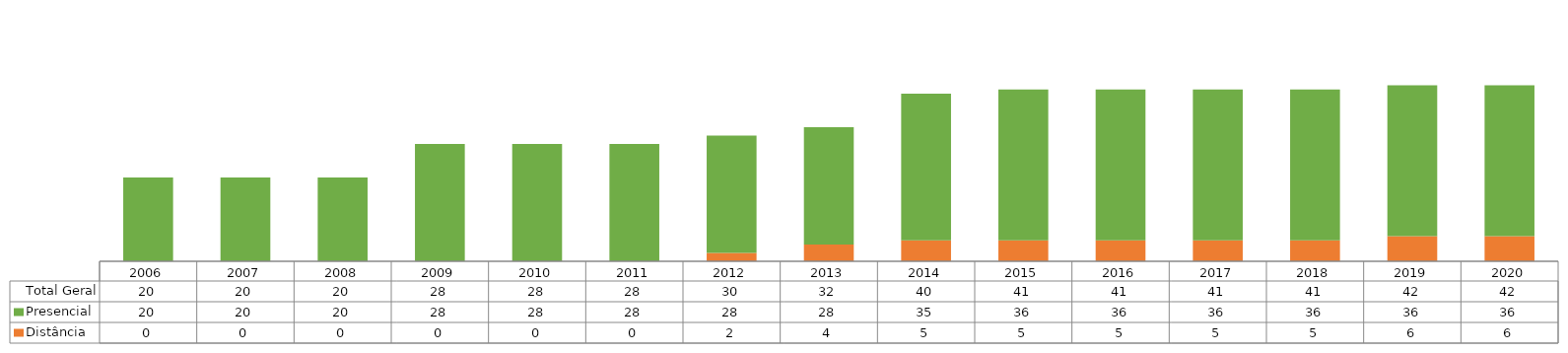
| Category | Distância | Presencial | Total Geral |
|---|---|---|---|
| 2006.0 | 0 | 20 | 20 |
| 2007.0 | 0 | 20 | 20 |
| 2008.0 | 0 | 20 | 20 |
| 2009.0 | 0 | 28 | 28 |
| 2010.0 | 0 | 28 | 28 |
| 2011.0 | 0 | 28 | 28 |
| 2012.0 | 2 | 28 | 30 |
| 2013.0 | 4 | 28 | 32 |
| 2014.0 | 5 | 35 | 40 |
| 2015.0 | 5 | 36 | 41 |
| 2016.0 | 5 | 36 | 41 |
| 2017.0 | 5 | 36 | 41 |
| 2018.0 | 5 | 36 | 41 |
| 2019.0 | 6 | 36 | 42 |
| 2020.0 | 6 | 36 | 42 |